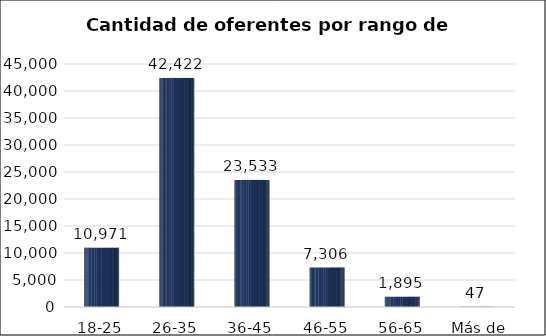
| Category | Cantidad de oferentes |
|---|---|
| 18-25 | 10971 |
| 26-35 | 42422 |
| 36-45 | 23533 |
| 46-55 | 7306 |
| 56-65 | 1895 |
| Más de 65 | 47 |